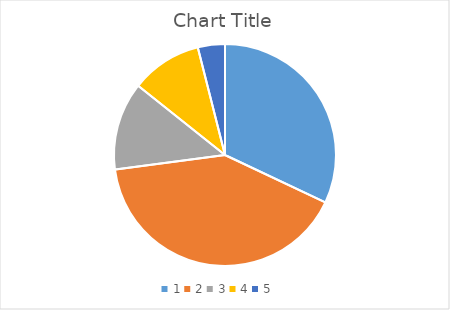
| Category | Series 0 |
|---|---|
| 0 | 32.02 |
| 1 | 40.887 |
| 2 | 12.808 |
| 3 | 10.345 |
| 4 | 3.941 |